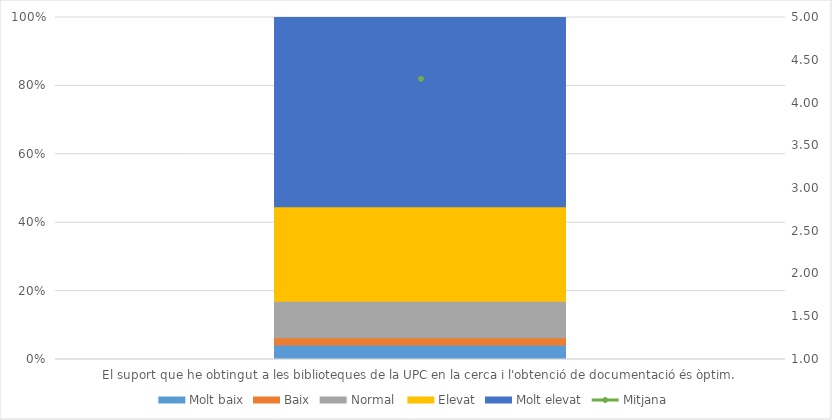
| Category | Molt baix | Baix | Normal  | Elevat | Molt elevat |
|---|---|---|---|---|---|
| El suport que he obtingut a les biblioteques de la UPC en la cerca i l'obtenció de documentació és òptim. | 2 | 1 | 5 | 13 | 26 |